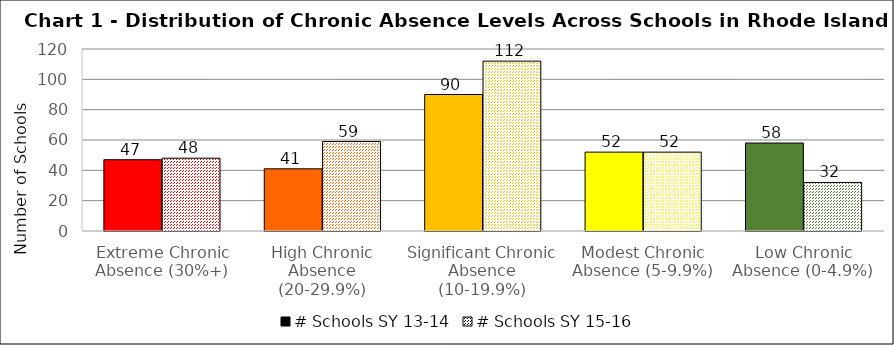
| Category | # Schools SY 13-14 | # Schools SY 15-16 |
|---|---|---|
| Extreme Chronic Absence (30%+) | 47 | 48 |
| High Chronic Absence (20-29.9%) | 41 | 59 |
| Significant Chronic Absence (10-19.9%) | 90 | 112 |
| Modest Chronic Absence (5-9.9%) | 52 | 52 |
| Low Chronic Absence (0-4.9%) | 58 | 32 |